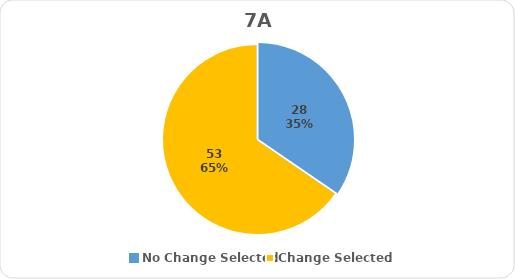
| Category | Series 0 |
|---|---|
| No Change Selected | 28 |
| Change Selected | 53 |